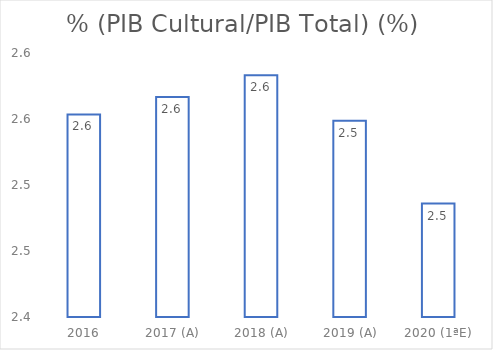
| Category | % (PIB Cultural/PIB Total) (%) |
|---|---|
| 2016 | 2.553 |
| 2017 (A) | 2.567 |
| 2018 (A) | 2.583 |
| 2019 (A) | 2.549 |
| 2020 (1ªE) | 2.486 |